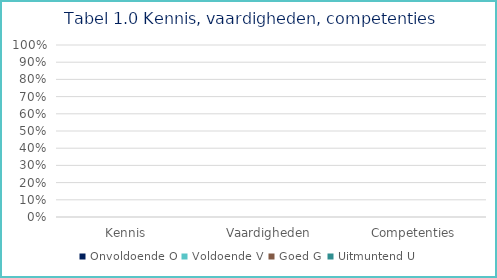
| Category | Onvoldoende | Voldoende | Goed | Uitmuntend |
|---|---|---|---|---|
| Kennis | 0 | 0 | 0 | 0 |
| Vaardigheden | 0 | 0 | 0 | 0 |
| Competenties | 0 | 0 | 0 | 0 |